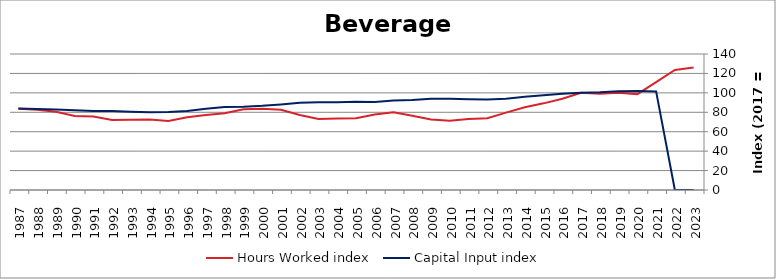
| Category | Hours Worked index | Capital Input index |
|---|---|---|
| 2023.0 | 126.11 | 0 |
| 2022.0 | 123.59 | 0 |
| 2021.0 | 110.986 | 101.484 |
| 2020.0 | 98.701 | 101.843 |
| 2019.0 | 100.191 | 101.549 |
| 2018.0 | 99.117 | 100.528 |
| 2017.0 | 100 | 100 |
| 2016.0 | 93.958 | 98.99 |
| 2015.0 | 89.2 | 97.479 |
| 2014.0 | 85.09 | 96.017 |
| 2013.0 | 79.64 | 93.995 |
| 2012.0 | 73.877 | 93.284 |
| 2011.0 | 73.102 | 93.446 |
| 2010.0 | 71.205 | 94.019 |
| 2009.0 | 72.541 | 93.915 |
| 2008.0 | 76.425 | 92.566 |
| 2007.0 | 79.929 | 92.206 |
| 2006.0 | 77.748 | 90.471 |
| 2005.0 | 73.874 | 90.833 |
| 2004.0 | 73.691 | 90.449 |
| 2003.0 | 73.217 | 90.348 |
| 2002.0 | 77.192 | 89.801 |
| 2001.0 | 82.678 | 88.091 |
| 2000.0 | 83.659 | 86.666 |
| 1999.0 | 83.074 | 85.697 |
| 1998.0 | 79.042 | 85.372 |
| 1997.0 | 77.188 | 83.541 |
| 1996.0 | 74.87 | 81.424 |
| 1995.0 | 71.025 | 80.352 |
| 1994.0 | 72.52 | 79.912 |
| 1993.0 | 72.323 | 80.614 |
| 1992.0 | 72.182 | 81.206 |
| 1991.0 | 75.599 | 81.398 |
| 1990.0 | 76.282 | 82.073 |
| 1989.0 | 80.514 | 82.896 |
| 1988.0 | 82.554 | 83.46 |
| 1987.0 | 83.602 | 84.019 |